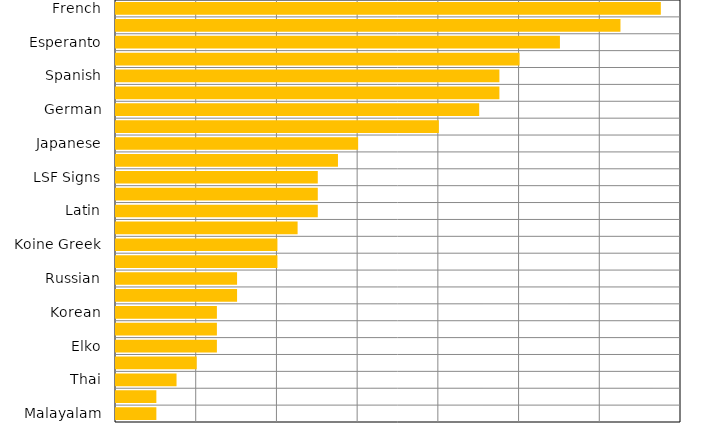
| Category | Series 0 |
|---|---|
| French | 6.75 |
| English | 6.25 |
| Esperanto | 5.5 |
| Mandarin | 5 |
| Spanish | 4.75 |
| Vietnamese | 4.75 |
| German | 4.5 |
| Malay | 4 |
| Japanese | 3 |
| Farsi | 2.75 |
| LSF Signs | 2.5 |
| Arabic | 2.5 |
| Latin | 2.5 |
| Sanskrit | 2.25 |
| Koine Greek | 2 |
| Hebrew | 2 |
| Russian | 1.5 |
| Swedish | 1.5 |
| Korean | 1.25 |
| Turkish | 1.25 |
| Elko | 1.25 |
| Phoenician | 1 |
| Thai | 0.75 |
| Tamil | 0.5 |
| Malayalam | 0.5 |